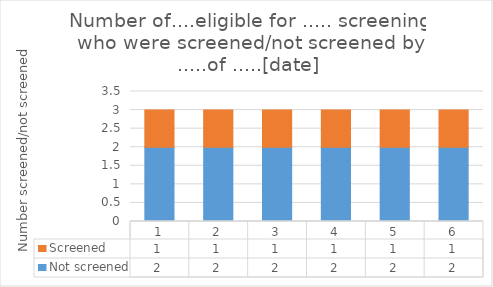
| Category | Not screened | Screened |
|---|---|---|
| 0 | 2 | 1 |
| 1 | 2 | 1 |
| 2 | 2 | 1 |
| 3 | 2 | 1 |
| 4 | 2 | 1 |
| 5 | 2 | 1 |